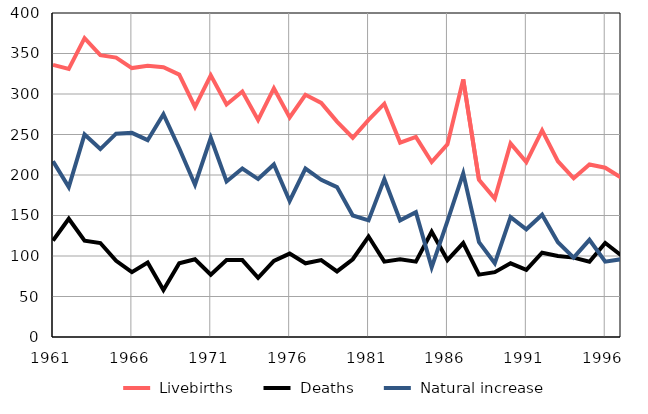
| Category |  Livebirths |  Deaths |  Natural increase |
|---|---|---|---|
| 1961.0 | 336 | 119 | 217 |
| 1962.0 | 331 | 146 | 185 |
| 1963.0 | 369 | 119 | 250 |
| 1964.0 | 348 | 116 | 232 |
| 1965.0 | 345 | 94 | 251 |
| 1966.0 | 332 | 80 | 252 |
| 1967.0 | 335 | 92 | 243 |
| 1968.0 | 333 | 58 | 275 |
| 1969.0 | 324 | 91 | 233 |
| 1970.0 | 284 | 96 | 188 |
| 1971.0 | 323 | 77 | 246 |
| 1972.0 | 287 | 95 | 192 |
| 1973.0 | 303 | 95 | 208 |
| 1974.0 | 268 | 73 | 195 |
| 1975.0 | 307 | 94 | 213 |
| 1976.0 | 271 | 103 | 168 |
| 1977.0 | 299 | 91 | 208 |
| 1978.0 | 289 | 95 | 194 |
| 1979.0 | 266 | 81 | 185 |
| 1980.0 | 246 | 96 | 150 |
| 1981.0 | 268 | 124 | 144 |
| 1982.0 | 288 | 93 | 195 |
| 1983.0 | 240 | 96 | 144 |
| 1984.0 | 247 | 93 | 154 |
| 1985.0 | 216 | 130 | 86 |
| 1986.0 | 238 | 95 | 143 |
| 1987.0 | 318 | 116 | 202 |
| 1988.0 | 194 | 77 | 117 |
| 1989.0 | 171 | 80 | 91 |
| 1990.0 | 239 | 91 | 148 |
| 1991.0 | 216 | 83 | 133 |
| 1992.0 | 255 | 104 | 151 |
| 1993.0 | 217 | 100 | 117 |
| 1994.0 | 196 | 98 | 98 |
| 1995.0 | 213 | 93 | 120 |
| 1996.0 | 209 | 116 | 93 |
| 1997.0 | 197 | 101 | 96 |